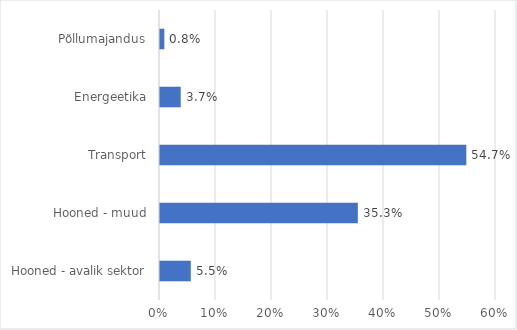
| Category | Series 0 |
|---|---|
| Hooned - avalik sektor | 0.055 |
| Hooned - muud | 0.353 |
| Transport | 0.547 |
| Energeetika | 0.037 |
| Põllumajandus | 0.008 |